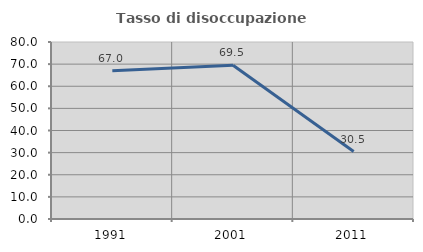
| Category | Tasso di disoccupazione giovanile  |
|---|---|
| 1991.0 | 67.05 |
| 2001.0 | 69.481 |
| 2011.0 | 30.488 |